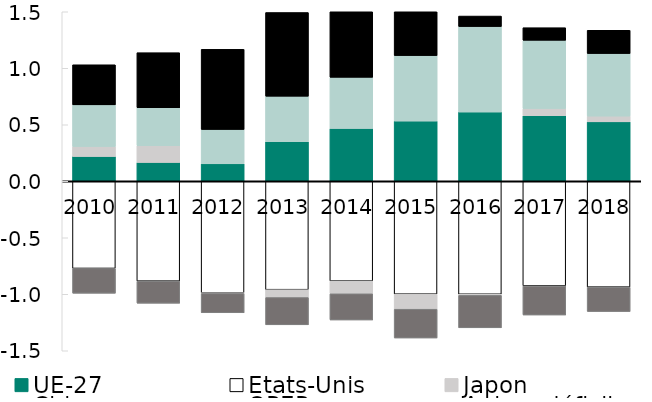
| Category | UE-27 | États-Unis | Japon | Chine | OPEP | Autres déficits |
|---|---|---|---|---|---|---|
| 2010.0 | 0.219 | -0.772 | 0.088 | 0.369 | 0.355 | -0.219 |
| 2011.0 | 0.167 | -0.884 | 0.148 | 0.336 | 0.488 | -0.195 |
| 2012.0 | 0.154 | -0.987 | -0.006 | 0.305 | 0.709 | -0.171 |
| 2013.0 | 0.35 | -0.96 | -0.069 | 0.403 | 0.741 | -0.242 |
| 2014.0 | 0.467 | -0.883 | -0.113 | 0.452 | 0.627 | -0.231 |
| 2015.0 | 0.532 | -0.999 | -0.133 | 0.58 | 0.498 | -0.254 |
| 2016.0 | 0.613 | -1 | -0.01 | 0.756 | 0.093 | -0.287 |
| 2017.0 | 0.581 | -0.926 | 0.063 | 0.604 | 0.112 | -0.257 |
| 2018.0 | 0.526 | -0.937 | 0.051 | 0.554 | 0.206 | -0.215 |